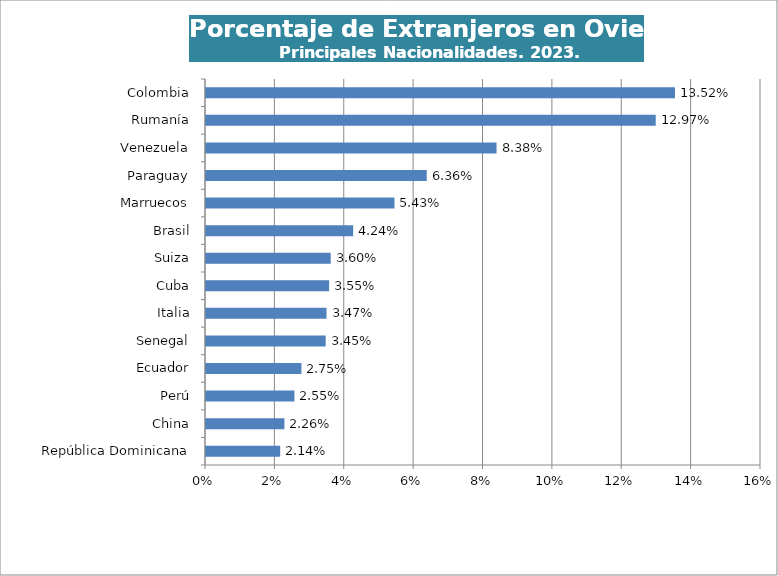
| Category | Series 0 |
|---|---|
| República Dominicana | 0.021 |
| China | 0.023 |
| Perú | 0.025 |
| Ecuador | 0.028 |
| Senegal | 0.035 |
| Italia | 0.035 |
| Cuba | 0.035 |
| Suiza | 0.036 |
| Brasil | 0.042 |
| Marruecos | 0.054 |
| Paraguay | 0.064 |
| Venezuela | 0.084 |
| Rumanía | 0.13 |
| Colombia | 0.135 |